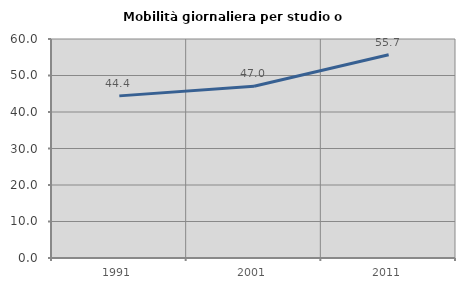
| Category | Mobilità giornaliera per studio o lavoro |
|---|---|
| 1991.0 | 44.418 |
| 2001.0 | 47.035 |
| 2011.0 | 55.687 |